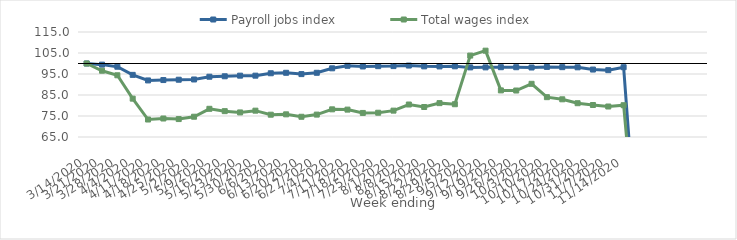
| Category | Payroll jobs index | Total wages index |
|---|---|---|
| 14/03/2020 | 100 | 100 |
| 21/03/2020 | 99.461 | 96.556 |
| 28/03/2020 | 98.462 | 94.397 |
| 04/04/2020 | 94.591 | 83.264 |
| 11/04/2020 | 91.938 | 73.323 |
| 18/04/2020 | 92.12 | 73.805 |
| 25/04/2020 | 92.275 | 73.535 |
| 02/05/2020 | 92.391 | 74.651 |
| 09/05/2020 | 93.7 | 78.424 |
| 16/05/2020 | 93.914 | 77.308 |
| 23/05/2020 | 94.21 | 76.704 |
| 30/05/2020 | 94.209 | 77.545 |
| 06/06/2020 | 95.35 | 75.618 |
| 13/06/2020 | 95.578 | 75.796 |
| 20/06/2020 | 94.949 | 74.635 |
| 27/06/2020 | 95.574 | 75.669 |
| 04/07/2020 | 97.707 | 78.174 |
| 11/07/2020 | 98.9 | 78.038 |
| 18/07/2020 | 98.584 | 76.452 |
| 25/07/2020 | 98.73 | 76.555 |
| 01/08/2020 | 98.767 | 77.559 |
| 08/08/2020 | 99.02 | 80.471 |
| 15/08/2020 | 98.635 | 79.286 |
| 22/08/2020 | 98.616 | 81.126 |
| 29/08/2020 | 98.666 | 80.606 |
| 05/09/2020 | 98.15 | 103.766 |
| 12/09/2020 | 98.16 | 106.104 |
| 19/09/2020 | 98.235 | 87.189 |
| 26/09/2020 | 98.225 | 87.131 |
| 03/10/2020 | 98.089 | 90.322 |
| 10/10/2020 | 98.364 | 83.971 |
| 17/10/2020 | 98.253 | 82.951 |
| 24/10/2020 | 98.189 | 81.092 |
| 31/10/2020 | 97.12 | 80.234 |
| 07/11/2020 | 96.826 | 79.516 |
| 14/11/2020 | 98.232 | 80.136 |